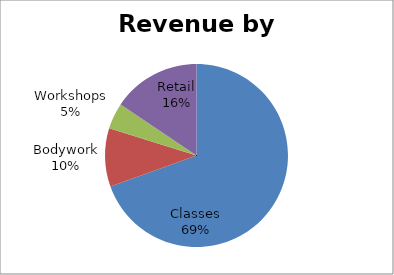
| Category | Series 0 |
|---|---|
| Classes | 13085 |
| Bodywork | 1943 |
| Workshops | 871 |
| Retail | 2932 |